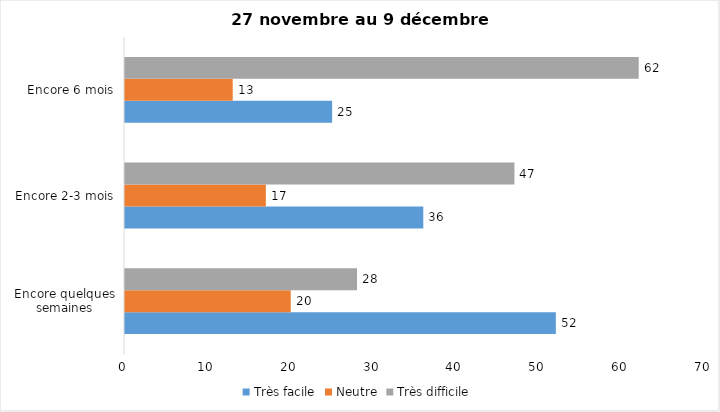
| Category | Très facile | Neutre | Très difficile |
|---|---|---|---|
| Encore quelques semaines | 52 | 20 | 28 |
| Encore 2-3 mois | 36 | 17 | 47 |
| Encore 6 mois | 25 | 13 | 62 |